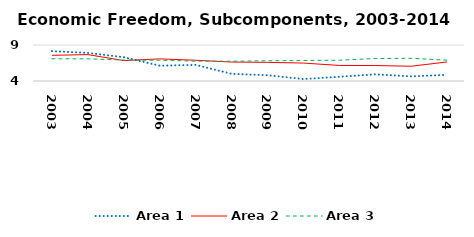
| Category | Area 1 | Area 2 | Area 3 |
|---|---|---|---|
| 2003.0 | 8.154 | 7.566 | 7.089 |
| 2004.0 | 7.898 | 7.666 | 7.079 |
| 2005.0 | 7.303 | 6.833 | 6.911 |
| 2006.0 | 6.128 | 7.074 | 6.88 |
| 2007.0 | 6.238 | 6.88 | 6.762 |
| 2008.0 | 5 | 6.634 | 6.743 |
| 2009.0 | 4.805 | 6.591 | 6.81 |
| 2010.0 | 4.271 | 6.493 | 6.841 |
| 2011.0 | 4.581 | 6.159 | 6.892 |
| 2012.0 | 4.926 | 6.15 | 7.12 |
| 2013.0 | 4.643 | 6.05 | 7.157 |
| 2014.0 | 4.856 | 6.646 | 6.896 |